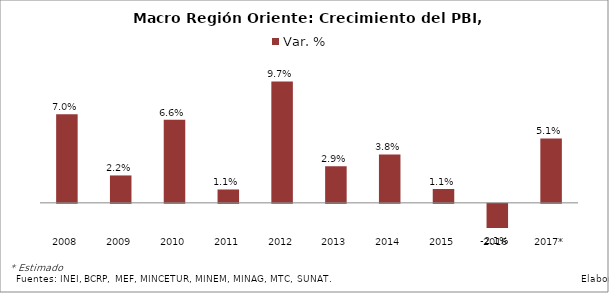
| Category | Var. % |
|---|---|
| 2008 | 0.07 |
| 2009 | 0.022 |
| 2010 | 0.066 |
| 2011 | 0.011 |
| 2012 | 0.097 |
| 2013 | 0.029 |
| 2014 | 0.038 |
| 2015 | 0.011 |
| 2016 | -0.021 |
| 2017* | 0.051 |